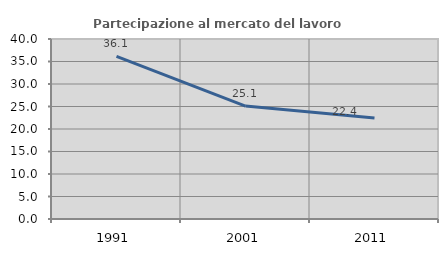
| Category | Partecipazione al mercato del lavoro  femminile |
|---|---|
| 1991.0 | 36.121 |
| 2001.0 | 25.104 |
| 2011.0 | 22.444 |